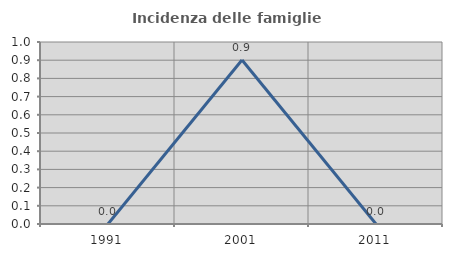
| Category | Incidenza delle famiglie numerose |
|---|---|
| 1991.0 | 0 |
| 2001.0 | 0.901 |
| 2011.0 | 0 |